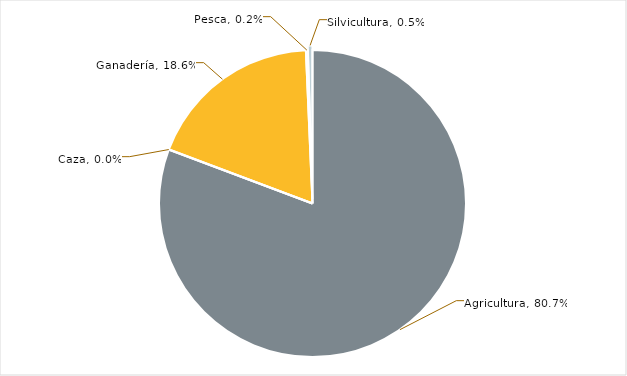
| Category | Series 0 |
|---|---|
| Agricultura | 0.807 |
| Caza | 0 |
| Ganadería | 0.186 |
| Pesca | 0.002 |
| Silvicultura | 0.005 |